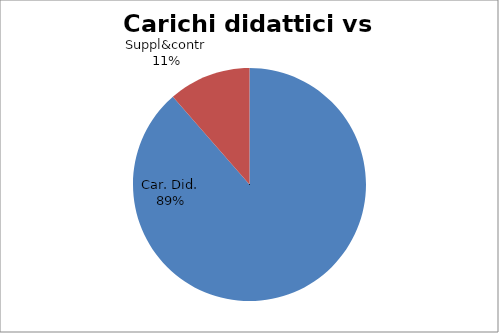
| Category | Series 0 |
|---|---|
| Car. Did. | 0.886 |
| Suppl&contr | 0.114 |